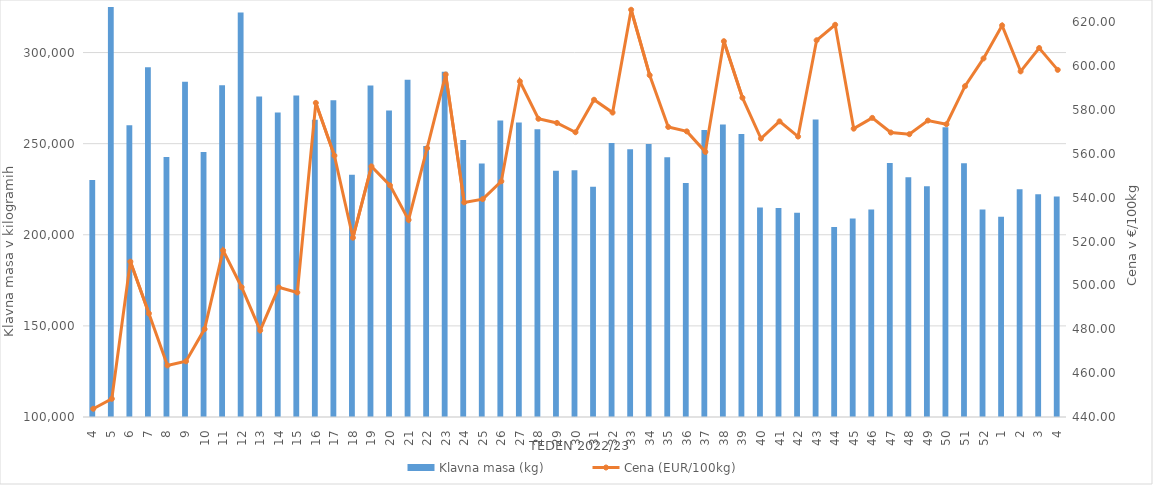
| Category | Klavna masa (kg) |
|---|---|
| 4.0 | 230074 |
| 5.0 | 328640 |
| 6.0 | 260108 |
| 7.0 | 291887 |
| 8.0 | 242732 |
| 9.0 | 283987 |
| 10.0 | 245414 |
| 11.0 | 282092 |
| 12.0 | 321936 |
| 13.0 | 275950 |
| 14.0 | 267148 |
| 15.0 | 276417 |
| 16.0 | 263098 |
| 17.0 | 273824 |
| 18.0 | 232926 |
| 19.0 | 281859 |
| 20.0 | 268153 |
| 21.0 | 285073 |
| 22.0 | 248783 |
| 23.0 | 289478 |
| 24.0 | 252069 |
| 25.0 | 239099 |
| 26.0 | 262689 |
| 27.0 | 261656 |
| 28.0 | 257905 |
| 29.0 | 235185 |
| 30.0 | 235475 |
| 31.0 | 226322 |
| 32.0 | 250418 |
| 33.0 | 246996 |
| 34.0 | 249873 |
| 35.0 | 242516 |
| 36.0 | 228469 |
| 37.0 | 257511 |
| 38.0 | 260481 |
| 39.0 | 255370 |
| 40.0 | 214936 |
| 41.0 | 214672 |
| 42.0 | 212066 |
| 43.0 | 263287 |
| 44.0 | 204280 |
| 45.0 | 208920 |
| 46.0 | 213836 |
| 47.0 | 239417 |
| 48.0 | 231565 |
| 49.0 | 226575 |
| 50.0 | 259073 |
| 51.0 | 239211 |
| 52.0 | 213841 |
| 1.0 | 209877 |
| 2.0 | 225045 |
| 3.0 | 222198 |
| 4.0 | 221002 |